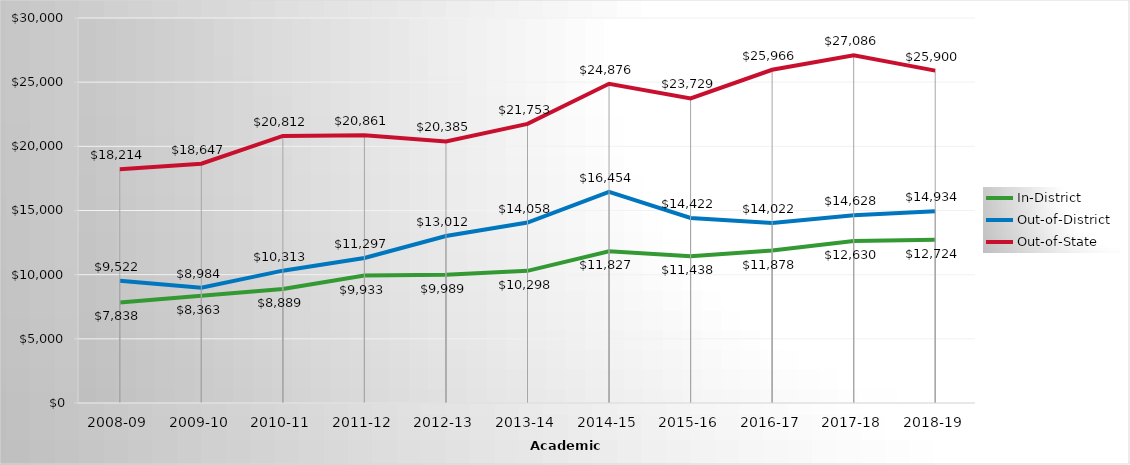
| Category | In-District | Out-of-District | Out-of-State |
|---|---|---|---|
| 2008-09 | 7838.053 | 9522.053 | 18213.684 |
| 2009-10 | 8363 | 8984 | 18647 |
| 2010-11 | 8889 | 10313 | 20812 |
| 2011-12 | 9933.23 | 11297.18 | 20861.23 |
| 2012-13 | 9988.67 | 13011.78 | 20384.67 |
| 2013-14 | 10297.84 | 14057.56 | 21753.28 |
| 2014-15 | 11827.062 | 16453.562 | 24875.688 |
| 2015-16 | 11438 | 14422 | 23729 |
| 2016-17 | 11878 | 14022 | 25966 |
| 2017-18 | 12630 | 14628 | 27086 |
| 2018-19 | 12724 | 14934 | 25900 |